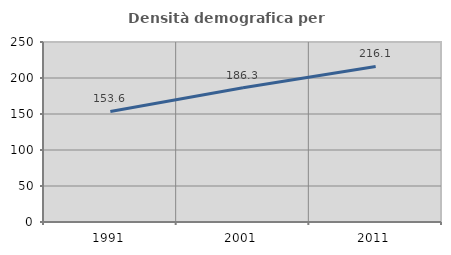
| Category | Densità demografica |
|---|---|
| 1991.0 | 153.554 |
| 2001.0 | 186.326 |
| 2011.0 | 216.083 |